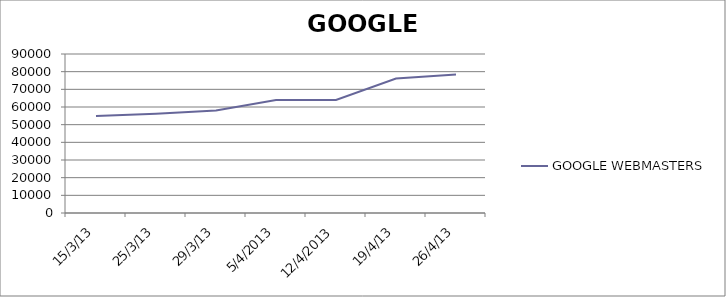
| Category | GOOGLE WEBMASTERS |
|---|---|
| 15/3/13 | 54851 |
| 25/3/13 | 56152 |
| 29/3/13 | 58025 |
| 4/5/2013 | 64018 |
| 4/12/2013 | 63966 |
| 19/4/13 | 76134 |
| 26/4/13 | 78429 |